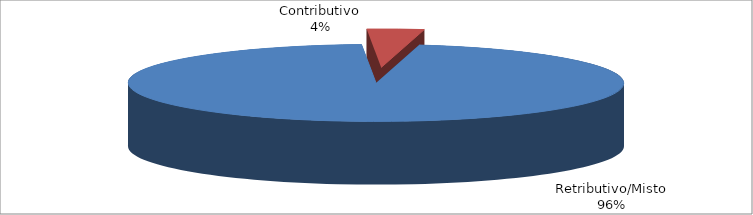
| Category | Decorrenti gennaio - settembre 2021 |
|---|---|
| Retributivo/Misto | 61634 |
| Contributivo | 2374 |